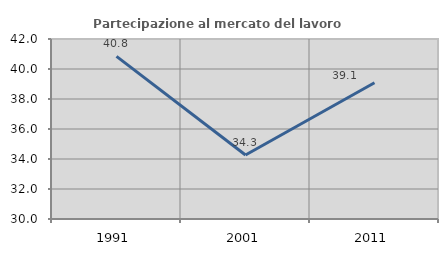
| Category | Partecipazione al mercato del lavoro  femminile |
|---|---|
| 1991.0 | 40.845 |
| 2001.0 | 34.27 |
| 2011.0 | 39.08 |